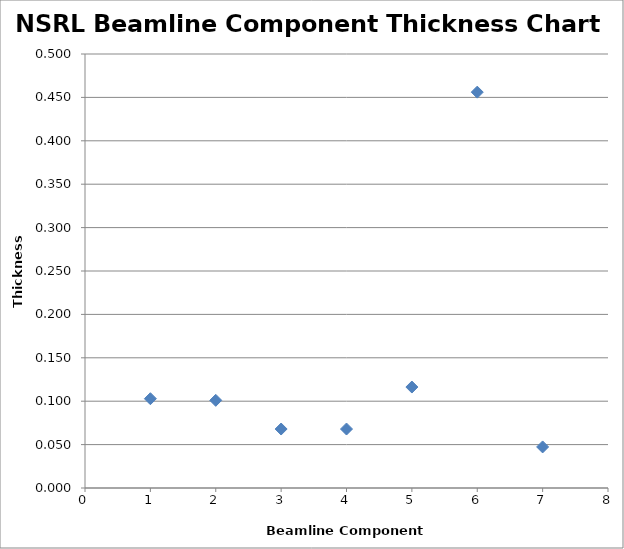
| Category | Series 0 |
|---|---|
| 1.0 | 0.103 |
| 2.0 | 0.101 |
| 3.0 | 0.068 |
| 4.0 | 0.068 |
| 5.0 | 0.116 |
| 6.0 | 0.456 |
| 7.0 | 0.047 |